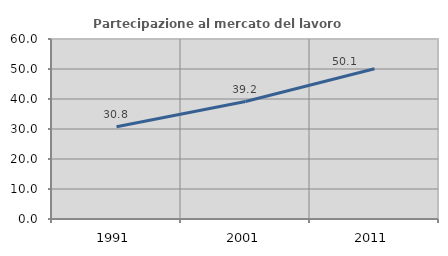
| Category | Partecipazione al mercato del lavoro  femminile |
|---|---|
| 1991.0 | 30.756 |
| 2001.0 | 39.155 |
| 2011.0 | 50.058 |